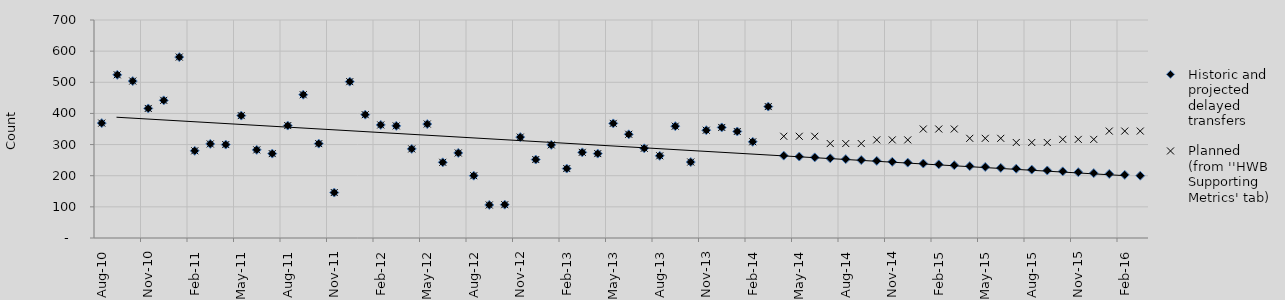
| Category | Historic and projected delayed transfers | Planned (from ''HWB Supporting Metrics' tab) |
|---|---|---|
| 2010-08-01 | 369 | 369 |
| 2010-09-01 | 524 | 524 |
| 2010-10-01 | 504 | 504 |
| 2010-11-01 | 416 | 416 |
| 2010-12-01 | 442 | 442 |
| 2011-01-01 | 581 | 581 |
| 2011-02-01 | 280 | 280 |
| 2011-03-01 | 302 | 302 |
| 2011-04-01 | 300 | 300 |
| 2011-05-01 | 393 | 393 |
| 2011-06-01 | 283 | 283 |
| 2011-07-01 | 271 | 271 |
| 2011-08-01 | 361 | 361 |
| 2011-09-01 | 460 | 460 |
| 2011-10-01 | 303 | 303 |
| 2011-11-01 | 146 | 146 |
| 2011-12-01 | 502 | 502 |
| 2012-01-01 | 396 | 396 |
| 2012-02-01 | 363 | 363 |
| 2012-03-01 | 360 | 360 |
| 2012-04-01 | 286 | 286 |
| 2012-05-01 | 366 | 366 |
| 2012-06-01 | 243 | 243 |
| 2012-07-01 | 273 | 273 |
| 2012-08-01 | 200 | 200 |
| 2012-09-01 | 106 | 106 |
| 2012-10-01 | 107 | 107 |
| 2012-11-01 | 324 | 324 |
| 2012-12-01 | 252 | 252 |
| 2013-01-01 | 299 | 299 |
| 2013-02-01 | 223 | 223 |
| 2013-03-01 | 275 | 275 |
| 2013-04-01 | 271 | 271 |
| 2013-05-01 | 368 | 368 |
| 2013-06-01 | 333 | 333 |
| 2013-07-01 | 288 | 288 |
| 2013-08-01 | 264 | 264 |
| 2013-09-01 | 359 | 359 |
| 2013-10-01 | 244 | 244 |
| 2013-11-01 | 346 | 346 |
| 2013-12-01 | 355 | 355 |
| 2014-01-01 | 342 | 342 |
| 2014-02-01 | 309 | 309 |
| 2014-03-01 | 422 | 422 |
| 2014-04-01 | 264.448 | 326.667 |
| 2014-05-01 | 261.645 | 326.667 |
| 2014-06-01 | 258.842 | 326.667 |
| 2014-07-01 | 256.038 | 303.333 |
| 2014-08-01 | 253.235 | 303.333 |
| 2014-09-01 | 250.432 | 303.333 |
| 2014-10-01 | 247.628 | 315 |
| 2014-11-01 | 244.825 | 315 |
| 2014-12-01 | 242.022 | 315 |
| 2015-01-01 | 239.218 | 350 |
| 2015-02-01 | 236.415 | 350 |
| 2015-03-01 | 233.612 | 350 |
| 2015-04-01 | 230.808 | 320 |
| 2015-05-01 | 228.005 | 320 |
| 2015-06-01 | 225.202 | 320 |
| 2015-07-01 | 222.399 | 306.667 |
| 2015-08-01 | 219.595 | 306.667 |
| 2015-09-01 | 216.792 | 306.667 |
| 2015-10-01 | 213.989 | 316.667 |
| 2015-11-01 | 211.185 | 316.667 |
| 2015-12-01 | 208.382 | 316.667 |
| 2016-01-01 | 205.579 | 343.333 |
| 2016-02-01 | 202.775 | 343.333 |
| 2016-03-01 | 199.972 | 343.333 |